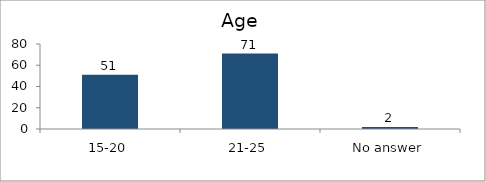
| Category | Age |
|---|---|
| 15-20 | 51 |
| 21-25 | 71 |
| No answer | 2 |